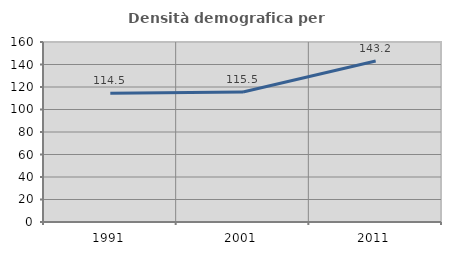
| Category | Densità demografica |
|---|---|
| 1991.0 | 114.537 |
| 2001.0 | 115.481 |
| 2011.0 | 143.172 |